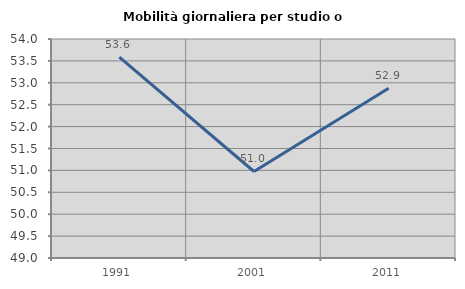
| Category | Mobilità giornaliera per studio o lavoro |
|---|---|
| 1991.0 | 53.584 |
| 2001.0 | 50.975 |
| 2011.0 | 52.874 |